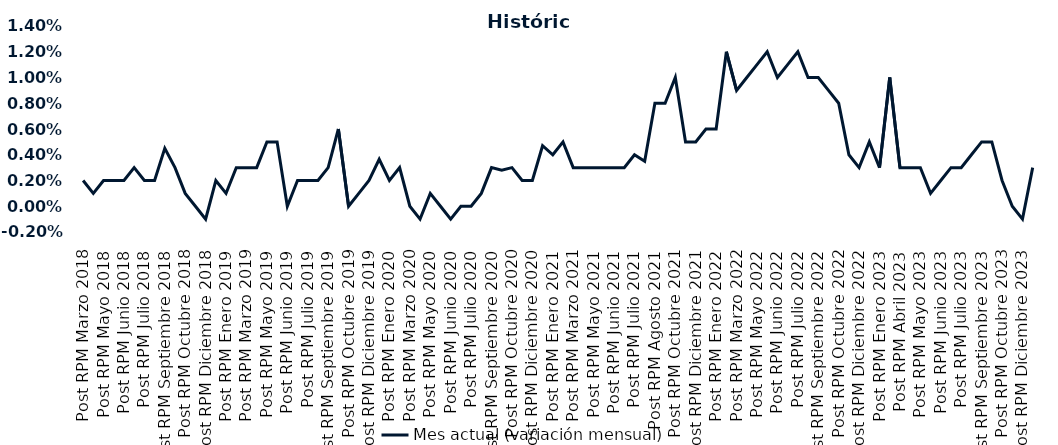
| Category | Mes actual (variación mensual)  |
|---|---|
| Post RPM Marzo 2018 | 0.002 |
| Pre RPM Mayo 2018 | 0.001 |
| Post RPM Mayo 2018 | 0.002 |
| Pre RPM Junio 2018 | 0.002 |
| Post RPM Junio 2018 | 0.002 |
| Pre RPM Julio 2018 | 0.003 |
| Post RPM Julio 2018 | 0.002 |
| Pre RPM Septiembre 2018 | 0.002 |
| Post RPM Septiembre 2018 | 0.004 |
| Pre RPM Octubre 2018 | 0.003 |
| Post RPM Octubre 2018 | 0.001 |
| Pre RPM Diciembre 2018 | 0 |
| Post RPM Diciembre 2018 | -0.001 |
| Pre RPM Enero 2019 | 0.002 |
| Post RPM Enero 2019 | 0.001 |
| Pre RPM Marzo 2019 | 0.003 |
| Post RPM Marzo 2019 | 0.003 |
| Pre RPM Mayo 2019 | 0.003 |
| Post RPM Mayo 2019 | 0.005 |
| Pre RPM Junio 2019 | 0.005 |
| Post RPM Junio 2019 | 0 |
| Pre RPM Julio 2019 | 0.002 |
| Post RPM Julio 2019 | 0.002 |
| Pre RPM Septiembre 2019 | 0.002 |
| Post RPM Septiembre 2019 | 0.003 |
| Pre RPM Octubre 2019 | 0.006 |
| Post RPM Octubre 2019 | 0 |
| Pre RPM Diciembre 2019 | 0.001 |
| Post RPM Diciembre 2019 | 0.002 |
| Pre RPM Enero 2020 | 0.004 |
| Post RPM Enero 2020 | 0.002 |
| Pre RPM Marzo 2020 | 0.003 |
| Post RPM Marzo 2020 | 0 |
| Pre RPM Mayo 2020 | -0.001 |
| Post RPM Mayo 2020 | 0.001 |
| Pre RPM Junio 2020 | 0 |
| Post RPM Junio 2020 | -0.001 |
| Pre RPM Julio 2020 | 0 |
| Post RPM Julio 2020 | 0 |
| Pre RPM Septiembre 2020 | 0.001 |
| Post RPM Septiembre 2020 | 0.003 |
| Pre RPM Octubre 2020 | 0.003 |
| Post RPM Octubre 2020 | 0.003 |
| Pre RPM Diciembre 2020 | 0.002 |
| Post RPM Diciembre 2020 | 0.002 |
| Pre RPM Enero 2021 | 0.005 |
| Post RPM Enero 2021 | 0.004 |
| Pre RPM Marzo 2021 | 0.005 |
| Post RPM Marzo 2021 | 0.003 |
| Pre RPM Mayo 2021 | 0.003 |
| Post RPM Mayo 2021 | 0.003 |
| Pre RPM Junio 2021 | 0.003 |
| Post RPM Junio 2021 | 0.003 |
| Pre RPM Julio 2021 | 0.003 |
| Post RPM Julio 2021 | 0.004 |
| Pre RPM Agosto 2021 | 0.004 |
| Post RPM Agosto 2021 | 0.008 |
| Pre RPM Octubre 2021 | 0.008 |
| Post RPM Octubre 2021 | 0.01 |
| Pre RPM Diciembre 2021 | 0.005 |
| Post RPM Diciembre 2021 | 0.005 |
| Pre RPM Enero 2022 | 0.006 |
| Post RPM Enero 2022 | 0.006 |
| Pre RPM Marzo 2022 | 0.012 |
| Post RPM Marzo 2022 | 0.009 |
| Pre RPM Mayo 2022 | 0.01 |
| Post RPM Mayo 2022 | 0.011 |
| Pre RPM Junio 2022 | 0.012 |
| Post RPM Junio 2022 | 0.01 |
| Pre RPM Julio 2022 | 0.011 |
| Post RPM Julio 2022 | 0.012 |
| Pre RPM Septiembre 2022 | 0.01 |
| Post RPM Septiembre 2022 | 0.01 |
| Pre RPM Octubre 2022 | 0.009 |
| Post RPM Octubre 2022 | 0.008 |
| Pre RPM Diciembre 2022 | 0.004 |
| Post RPM Diciembre 2022 | 0.003 |
| Pre RPM Enero 2023 | 0.005 |
| Post RPM Enero 2023 | 0.003 |
| Pre RPM Abril 2023 | 0.01 |
| Post RPM Abril 2023 | 0.003 |
| Pre RPM Mayo 2023 | 0.003 |
| Post RPM Mayo 2023 | 0.003 |
| Pre RPM Junio 2023 | 0.001 |
| Post RPM Junio 2023 | 0.002 |
| Pre RPM Julio 2023 | 0.003 |
| Post RPM Julio 2023 | 0.003 |
| Pre RPM Septiembre 2023 | 0.004 |
| Post RPM Septiembre 2023 | 0.005 |
| Pre RPM Octubre 2023 | 0.005 |
| Post RPM Octubre 2023 | 0.002 |
| Pre RPM Diciembre 2023 | 0 |
| Post RPM Diciembre 2023 | -0.001 |
| Pre RPM Enero 2024 | 0.003 |